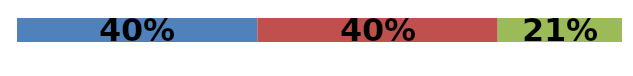
| Category | Series 0 | Series 1 | Series 2 |
|---|---|---|---|
| 0 | 0.397 | 0.397 | 0.205 |